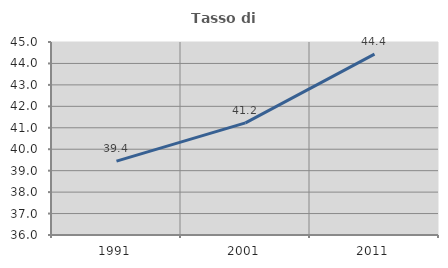
| Category | Tasso di occupazione   |
|---|---|
| 1991.0 | 39.445 |
| 2001.0 | 41.231 |
| 2011.0 | 44.438 |